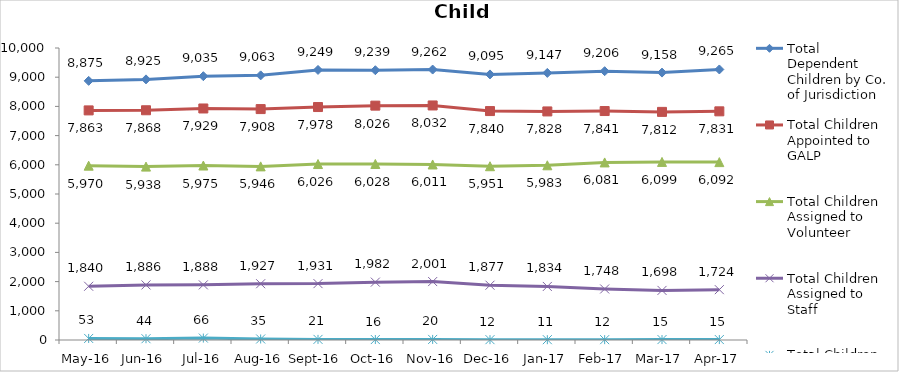
| Category | Total Dependent Children by Co. of Jurisdiction | Total Children Appointed to GALP | Total Children Assigned to Volunteer | Total Children Assigned to Staff | Total Children Unassigned |
|---|---|---|---|---|---|
| May-16 | 8875 | 7863 | 5970 | 1840 | 53 |
| Jun-16 | 8925 | 7868 | 5938 | 1886 | 44 |
| Jul-16 | 9035 | 7929 | 5975 | 1888 | 66 |
| Aug-16 | 9063 | 7908 | 5946 | 1927 | 35 |
| Sep-16 | 9249 | 7978 | 6026 | 1931 | 21 |
| Oct-16 | 9239 | 8026 | 6028 | 1982 | 16 |
| Nov-16 | 9262 | 8032 | 6011 | 2001 | 20 |
| Dec-16 | 9095 | 7840 | 5951 | 1877 | 12 |
| Jan-17 | 9147 | 7828 | 5983 | 1834 | 11 |
| Feb-17 | 9206 | 7841 | 6081 | 1748 | 12 |
| Mar-17 | 9158 | 7812 | 6099 | 1698 | 15 |
| Apr-17 | 9265 | 7831 | 6092 | 1724 | 15 |